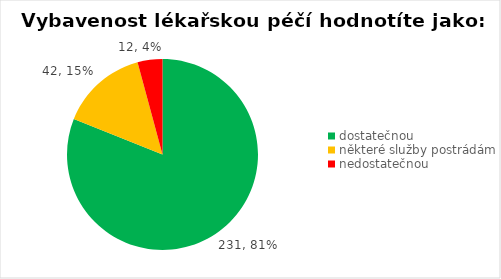
| Category | Series 0 |
|---|---|
| dostatečnou | 231 |
| některé služby postrádám | 42 |
| nedostatečnou | 12 |